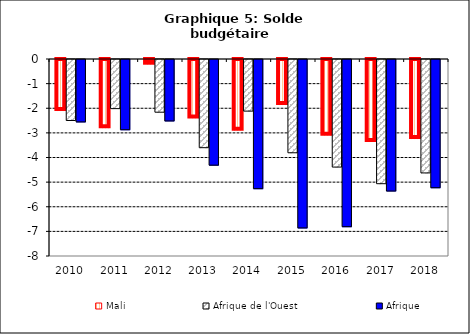
| Category | Mali | Afrique de l'Ouest | Afrique |
|---|---|---|---|
| 2010.0 | -2.074 | -2.477 | -2.535 |
| 2011.0 | -2.774 | -1.995 | -2.853 |
| 2012.0 | -0.192 | -2.14 | -2.495 |
| 2013.0 | -2.371 | -3.581 | -4.291 |
| 2014.0 | -2.878 | -2.096 | -5.245 |
| 2015.0 | -1.831 | -3.788 | -6.84 |
| 2016.0 | -3.076 | -4.368 | -6.79 |
| 2017.0 | -3.326 | -5.043 | -5.342 |
| 2018.0 | -3.213 | -4.606 | -5.208 |